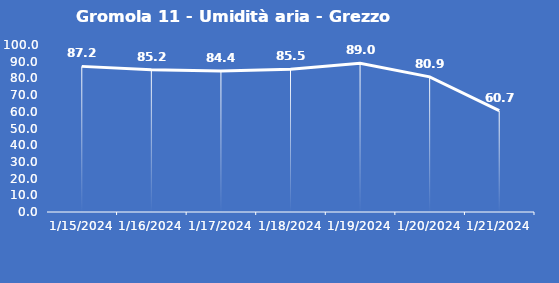
| Category | Gromola 11 - Umidità aria - Grezzo (%) |
|---|---|
| 1/15/24 | 87.2 |
| 1/16/24 | 85.2 |
| 1/17/24 | 84.4 |
| 1/18/24 | 85.5 |
| 1/19/24 | 89 |
| 1/20/24 | 80.9 |
| 1/21/24 | 60.7 |